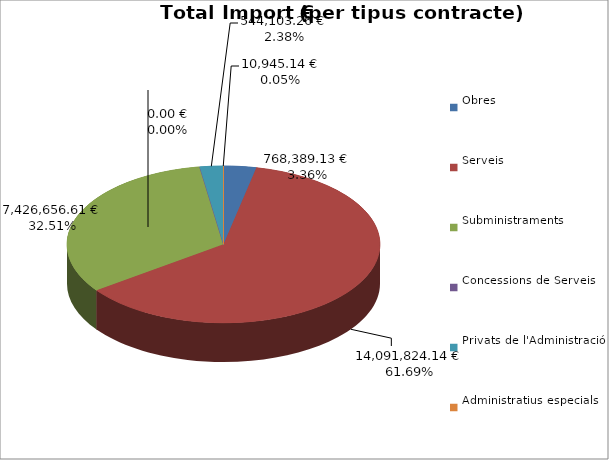
| Category | Total preu
(amb IVA) |
|---|---|
| Obres | 768389.13 |
| Serveis | 14091824.14 |
| Subministraments | 7426656.61 |
| Concessions de Serveis | 0 |
| Privats de l'Administració | 544103.26 |
| Administratius especials | 10945.14 |